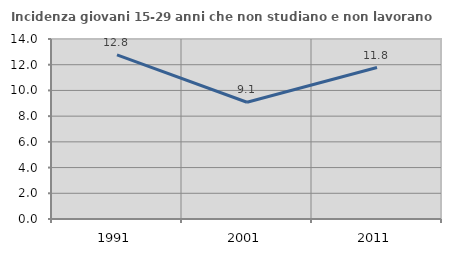
| Category | Incidenza giovani 15-29 anni che non studiano e non lavorano  |
|---|---|
| 1991.0 | 12.768 |
| 2001.0 | 9.08 |
| 2011.0 | 11.782 |